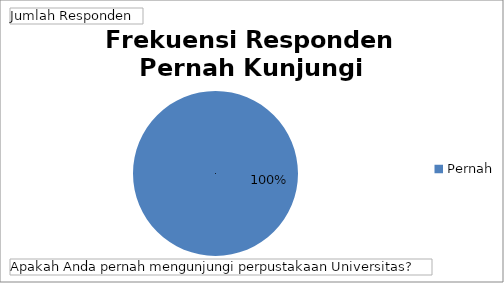
| Category | Total |
|---|---|
| Pernah | 78 |